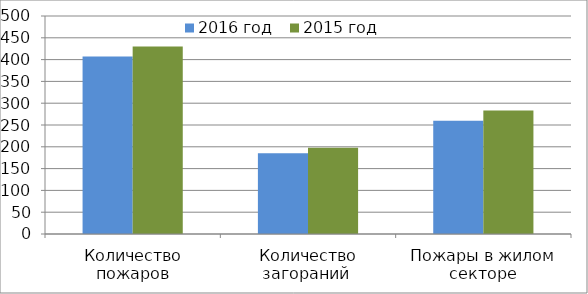
| Category | 2016 год | 2015 год |
|---|---|---|
| Количество пожаров | 407 | 430 |
| Количество загораний  | 185 | 198 |
| Пожары в жилом секторе | 260 | 283 |